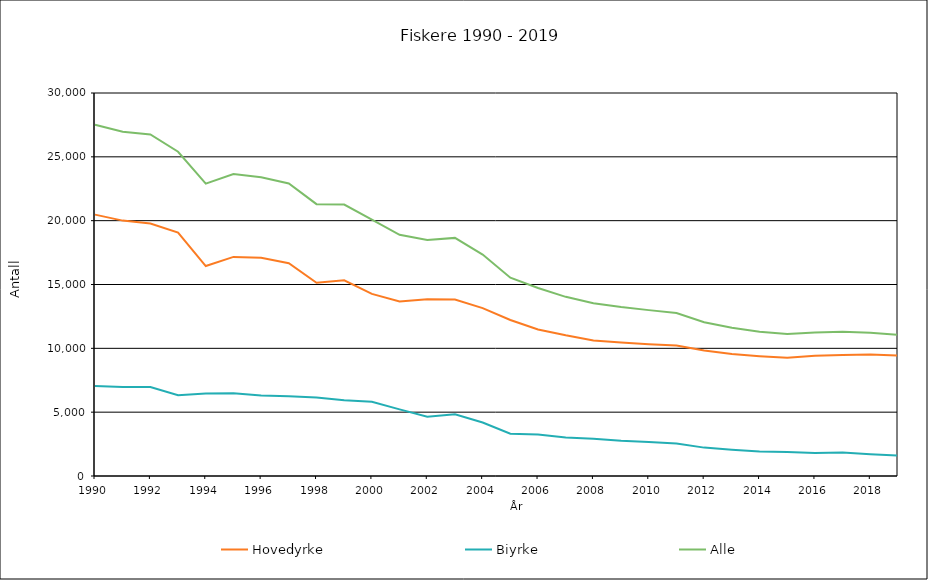
| Category | Hovedyrke | Biyrke | Alle |
|---|---|---|---|
| 1990.0 | 20475 | 7043 | 27518 |
| 1991.0 | 20004 | 6963 | 26967 |
| 1992.0 | 19780 | 6973 | 26753 |
| 1993.0 | 19073 | 6324 | 25397 |
| 1994.0 | 16446 | 6456 | 22902 |
| 1995.0 | 17160 | 6491 | 23651 |
| 1996.0 | 17087 | 6308 | 23395 |
| 1997.0 | 16663 | 6254 | 22917 |
| 1998.0 | 15140 | 6154 | 21294 |
| 1999.0 | 15327 | 5933 | 21260 |
| 2000.0 | 14264 | 5811 | 20075 |
| 2001.0 | 13674 | 5221 | 18895 |
| 2002.0 | 13841 | 4651 | 18492 |
| 2003.0 | 13821 | 4830 | 18651 |
| 2004.0 | 13150 | 4192 | 17342 |
| 2005.0 | 12216 | 3316 | 15532 |
| 2006.0 | 11475 | 3253 | 14728 |
| 2007.0 | 11018 | 3016 | 14034 |
| 2008.0 | 10619 | 2918 | 13537 |
| 2009.0 | 10465 | 2764 | 13229 |
| 2010.0 | 10325 | 2668 | 12993 |
| 2011.0 | 10220 | 2548 | 12768 |
| 2012.0 | 9825 | 2223 | 12048 |
| 2013.0 | 9559 | 2052 | 11611 |
| 2014.0 | 9386 | 1915 | 11301 |
| 2015.0 | 9259 | 1871 | 11130 |
| 2016.0 | 9426 | 1810 | 11236 |
| 2017.0 | 9473 | 1834 | 11307 |
| 2018.0 | 9514 | 1705 | 11219 |
| 2019.0 | 9444 | 1610 | 11054 |